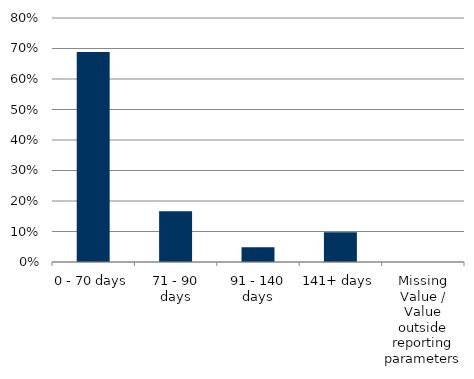
| Category | Total |
|---|---|
| 0 - 70 days | 0.688 |
| 71 - 90 days | 0.166 |
| 91 - 140 days | 0.049 |
| 141+ days | 0.097 |
| Missing Value / Value outside reporting parameters | 0 |